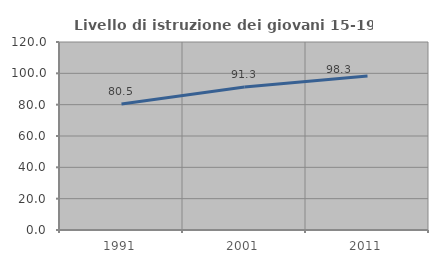
| Category | Livello di istruzione dei giovani 15-19 anni |
|---|---|
| 1991.0 | 80.451 |
| 2001.0 | 91.27 |
| 2011.0 | 98.261 |